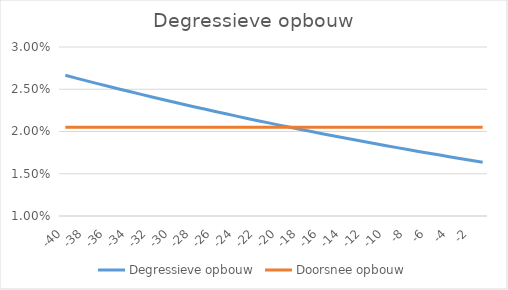
| Category | Degressieve opbouw | Doorsnee opbouw |
|---|---|---|
| -40.0 | 0.027 | 0.02 |
| -39.0 | 0.026 | 0.02 |
| -38.0 | 0.026 | 0.02 |
| -37.0 | 0.026 | 0.02 |
| -36.0 | 0.025 | 0.02 |
| -35.0 | 0.025 | 0.02 |
| -34.0 | 0.025 | 0.02 |
| -33.0 | 0.024 | 0.02 |
| -32.0 | 0.024 | 0.02 |
| -31.0 | 0.024 | 0.02 |
| -30.0 | 0.024 | 0.02 |
| -29.0 | 0.023 | 0.02 |
| -28.0 | 0.023 | 0.02 |
| -27.0 | 0.023 | 0.02 |
| -26.0 | 0.022 | 0.02 |
| -25.0 | 0.022 | 0.02 |
| -24.0 | 0.022 | 0.02 |
| -23.0 | 0.022 | 0.02 |
| -22.0 | 0.021 | 0.02 |
| -21.0 | 0.021 | 0.02 |
| -20.0 | 0.021 | 0.02 |
| -19.0 | 0.02 | 0.02 |
| -18.0 | 0.02 | 0.02 |
| -17.0 | 0.02 | 0.02 |
| -16.0 | 0.02 | 0.02 |
| -15.0 | 0.019 | 0.02 |
| -14.0 | 0.019 | 0.02 |
| -13.0 | 0.019 | 0.02 |
| -12.0 | 0.019 | 0.02 |
| -11.0 | 0.019 | 0.02 |
| -10.0 | 0.018 | 0.02 |
| -9.0 | 0.018 | 0.02 |
| -8.0 | 0.018 | 0.02 |
| -7.0 | 0.018 | 0.02 |
| -6.0 | 0.017 | 0.02 |
| -5.0 | 0.017 | 0.02 |
| -4.0 | 0.017 | 0.02 |
| -3.0 | 0.017 | 0.02 |
| -2.0 | 0.017 | 0.02 |
| -1.0 | 0.016 | 0.02 |